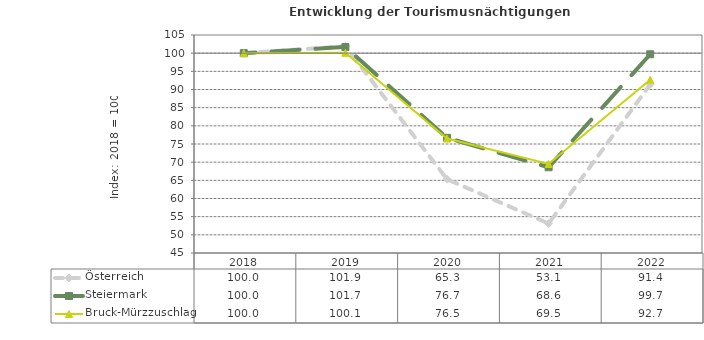
| Category | Österreich | Steiermark | Bruck-Mürzzuschlag |
|---|---|---|---|
| 2022.0 | 91.4 | 99.7 | 92.7 |
| 2021.0 | 53.1 | 68.6 | 69.5 |
| 2020.0 | 65.3 | 76.7 | 76.5 |
| 2019.0 | 101.9 | 101.7 | 100.1 |
| 2018.0 | 100 | 100 | 100 |